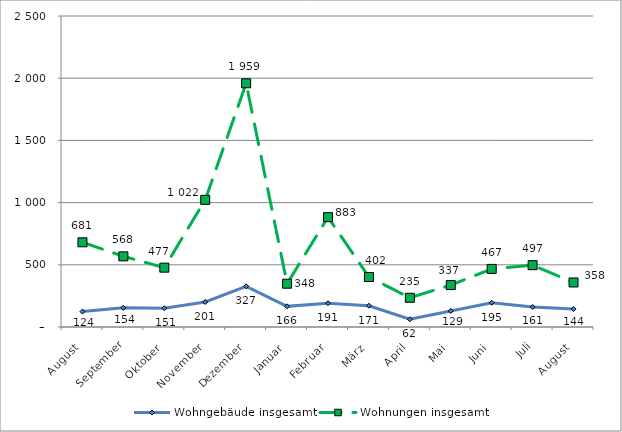
| Category | Wohngebäude insgesamt | Wohnungen insgesamt |
|---|---|---|
| August | 124 | 681 |
| September | 154 | 568 |
| Oktober | 151 | 477 |
| November | 201 | 1022 |
| Dezember | 327 | 1959 |
| Januar | 166 | 348 |
| Februar | 191 | 883 |
| März | 171 | 402 |
| April | 62 | 235 |
| Mai | 129 | 337 |
| Juni | 195 | 467 |
| Juli | 161 | 497 |
| August | 144 | 358 |